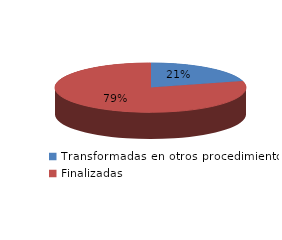
| Category | Series 0 |
|---|---|
| Transformadas en otros procedimientos | 18047 |
| Finalizadas | 69171 |